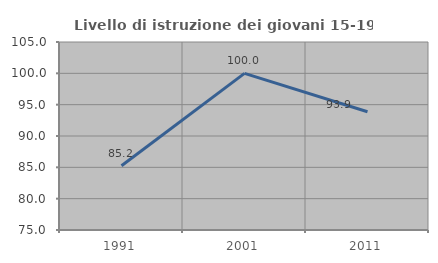
| Category | Livello di istruzione dei giovani 15-19 anni |
|---|---|
| 1991.0 | 85.246 |
| 2001.0 | 100 |
| 2011.0 | 93.878 |